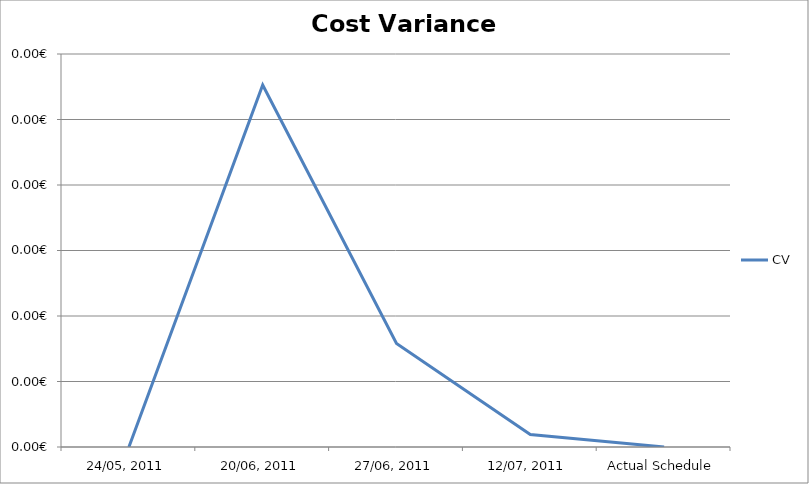
| Category | CV |
|---|---|
| 24/05, 2011 | 0 |
| 20/06, 2011 | 0 |
| 27/06, 2011 | 0 |
| 12/07, 2011 | 0 |
| Actual Schedule | 0 |